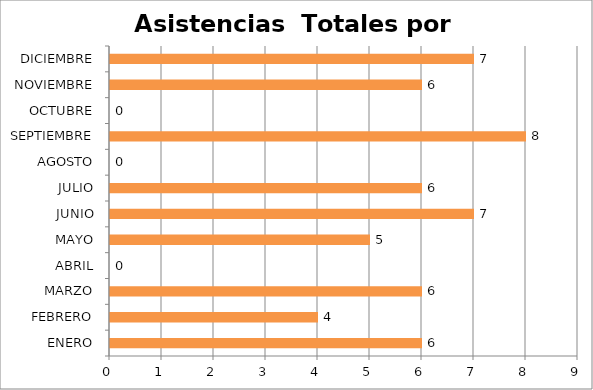
| Category | Series 0 |
|---|---|
| ENERO | 6 |
| FEBRERO | 4 |
| MARZO | 6 |
| ABRIL | 0 |
| MAYO | 5 |
| JUNIO | 7 |
| JULIO | 6 |
| AGOSTO | 0 |
| SEPTIEMBRE | 8 |
| OCTUBRE | 0 |
| NOVIEMBRE | 6 |
| DICIEMBRE | 7 |